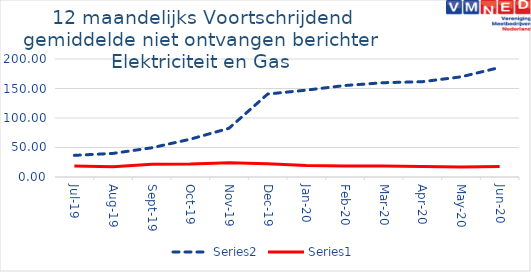
| Category | Series 3 | Series 0 |
|---|---|---|
| 2019-07-01 | 36.667 | 18.5 |
| 2019-08-01 | 40 | 17.583 |
| 2019-09-01 | 49.5 | 21.667 |
| 2019-10-01 | 64.083 | 21.917 |
| 2019-11-01 | 82.583 | 24.333 |
| 2019-12-01 | 140.583 | 22.333 |
| 2020-01-01 | 147.25 | 19.5 |
| 2020-02-01 | 155.083 | 18.667 |
| 2020-03-01 | 159.833 | 18.667 |
| 2020-04-01 | 161.5 | 17.75 |
| 2020-05-01 | 169.75 | 16.75 |
| 2020-06-01 | 185.583 | 17.75 |